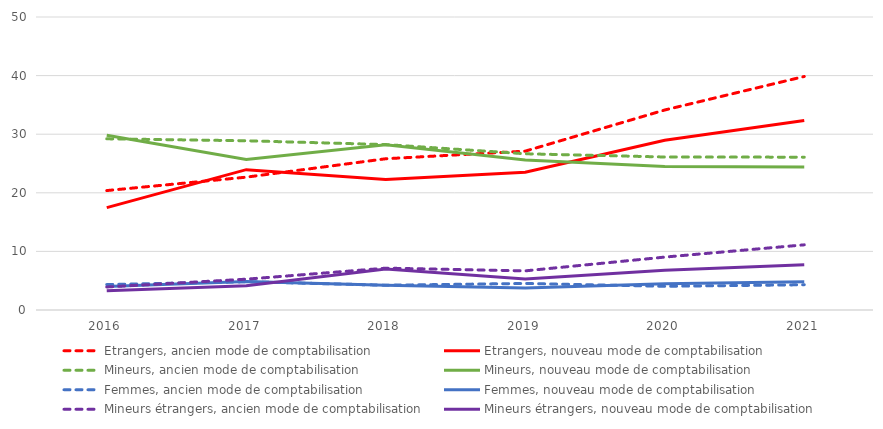
| Category | Etrangers, ancien mode de comptabilisation | Etrangers, nouveau mode de comptabilisation | Mineurs, ancien mode de comptabilisation | Mineurs, nouveau mode de comptabilisation | Femmes, ancien mode de comptabilisation | Femmes, nouveau mode de comptabilisation | Mineurs étrangers, ancien mode de comptabilisation | Mineurs étrangers, nouveau mode de comptabilisation |
|---|---|---|---|---|---|---|---|---|
| 2016.0 | 20.38 | 17.47 | 29.21 | 29.83 | 4.34 | 4.01 | 3.93 | 3.29 |
| 2017.0 | 22.67 | 23.95 | 28.88 | 25.67 | 4.82 | 4.88 | 5.26 | 4.15 |
| 2018.0 | 25.81 | 22.29 | 28.23 | 28.2 | 4.23 | 4.22 | 7.14 | 7 |
| 2019.0 | 27.11 | 23.52 | 26.66 | 25.59 | 4.53 | 3.74 | 6.68 | 5.28 |
| 2020.0 | 34.13 | 28.96 | 26.11 | 24.47 | 4.04 | 4.47 | 9.03 | 6.77 |
| 2021.0 | 39.85 | 32.35 | 26.08 | 24.39 | 4.31 | 4.82 | 11.12 | 7.71 |